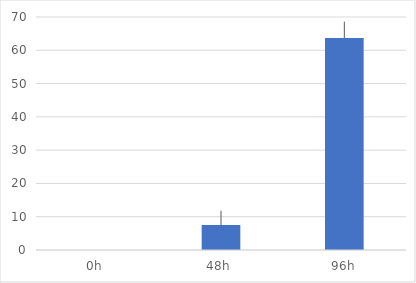
| Category | Series 0 |
|---|---|
| 0h  | 0 |
| 48h  | 7.475 |
| 96h | 63.67 |